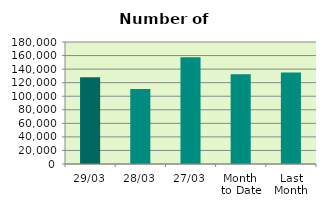
| Category | Series 0 |
|---|---|
| 29/03 | 127912 |
| 28/03 | 110662 |
| 27/03 | 157424 |
| Month 
to Date | 132498.571 |
| Last
Month | 135041.7 |